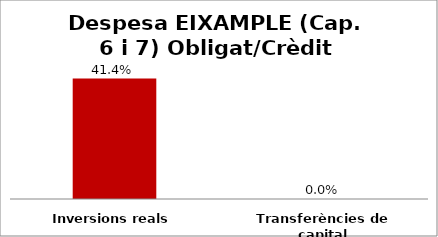
| Category | Series 0 |
|---|---|
| Inversions reals | 0.414 |
| Transferències de capital | 0 |